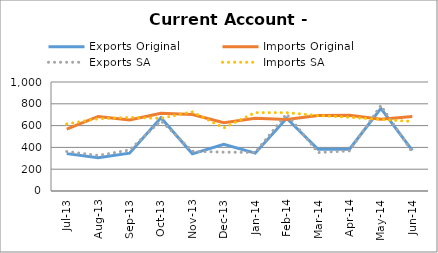
| Category | Exports Original | Imports Original | Exports SA | Imports SA |
|---|---|---|---|---|
| 2013-07-11 | 343 | 567 | 362 | 615 |
| 2013-08-11 | 305 | 684 | 326 | 663 |
| 2013-09-11 | 347 | 652 | 376 | 675 |
| 2013-10-11 | 671 | 713 | 644 | 667 |
| 2013-11-11 | 341 | 701 | 365 | 726 |
| 2013-12-11 | 428 | 626 | 356 | 579 |
| 2014-01-11 | 347 | 668 | 354 | 719 |
| 2014-02-11 | 667 | 656 | 707 | 719 |
| 2014-03-11 | 382 | 692 | 353 | 692 |
| 2014-04-11 | 383 | 695 | 368 | 676 |
| 2014-05-11 | 758 | 658 | 785 | 656 |
| 2014-06-11 | 373 | 683 | 356 | 638 |